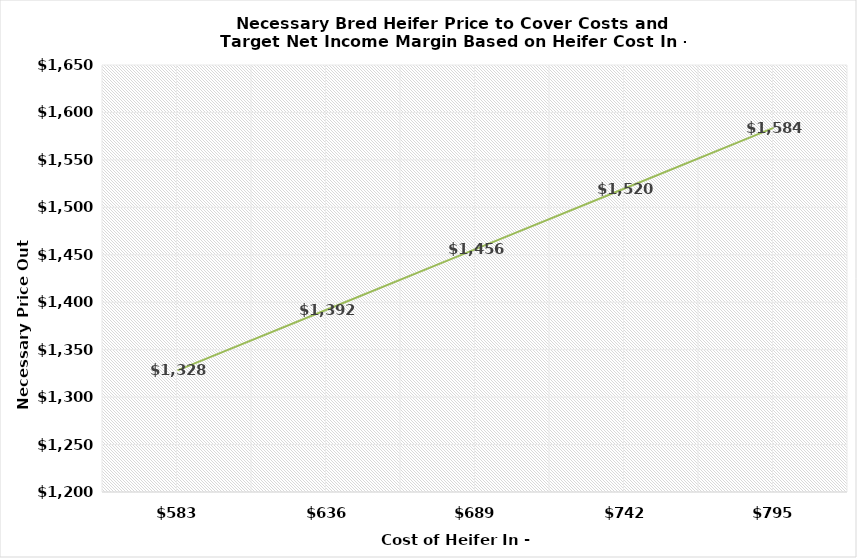
| Category | Price Out |
|---|---|
| 583.0 | 1328.136 |
| 636.0 | 1392.024 |
| 689.0 | 1455.911 |
| 742.0 | 1519.799 |
| 795.0 | 1583.686 |